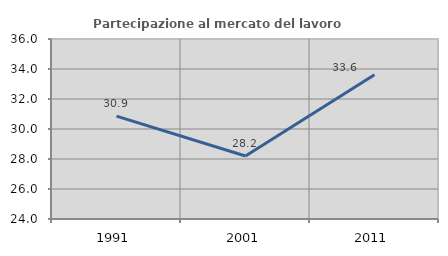
| Category | Partecipazione al mercato del lavoro  femminile |
|---|---|
| 1991.0 | 30.856 |
| 2001.0 | 28.203 |
| 2011.0 | 33.61 |